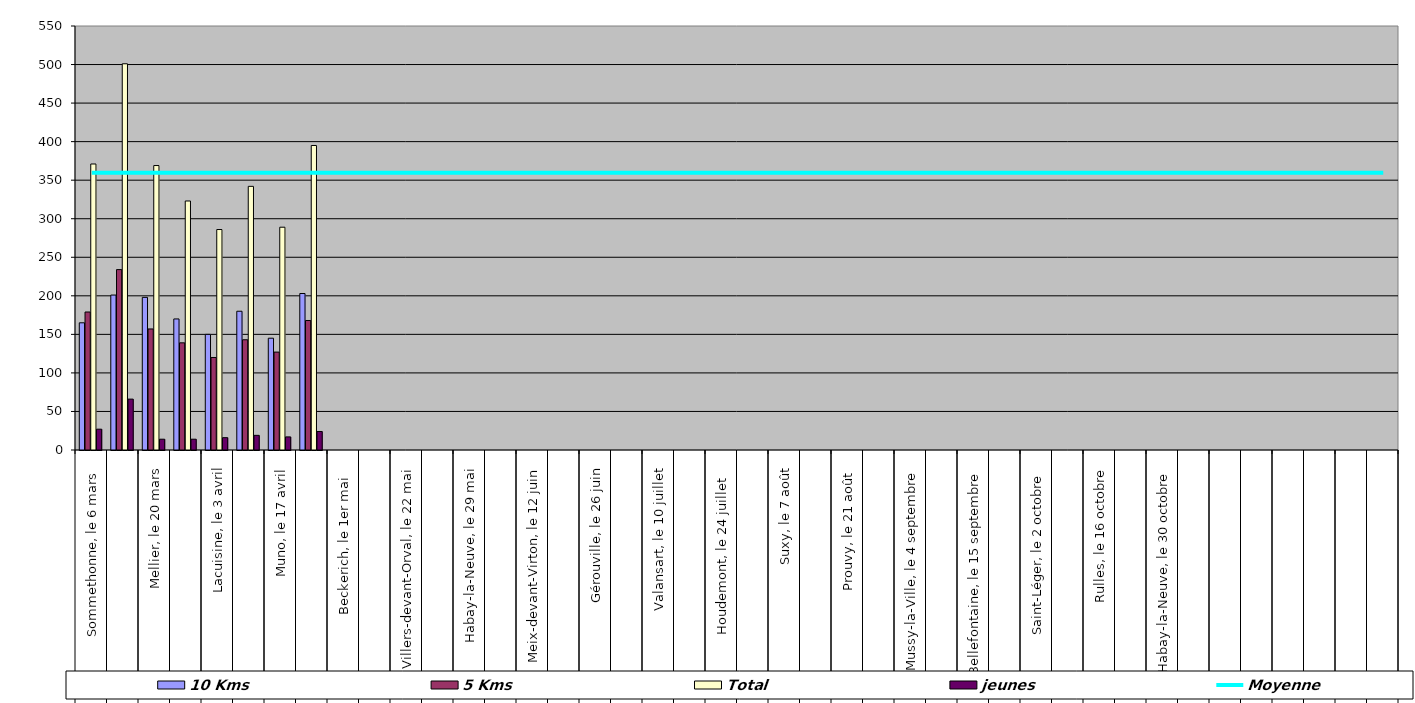
| Category | 10 Kms | 5 Kms | Total | jeunes |
|---|---|---|---|---|
| 0 | 165 | 179 | 371 | 27 |
| 1 | 201 | 234 | 501 | 66 |
| 2 | 198 | 157 | 369 | 14 |
| 3 | 170 | 139 | 323 | 14 |
| 4 | 150 | 120 | 286 | 16 |
| 5 | 180 | 143 | 342 | 19 |
| 6 | 145 | 127 | 289 | 17 |
| 7 | 203 | 168 | 395 | 24 |
| 8 | 0 | 0 | 0 | 0 |
| 9 | 0 | 0 | 0 | 0 |
| 10 | 0 | 0 | 0 | 0 |
| 11 | 0 | 0 | 0 | 0 |
| 12 | 0 | 0 | 0 | 0 |
| 13 | 0 | 0 | 0 | 0 |
| 14 | 0 | 0 | 0 | 0 |
| 15 | 0 | 0 | 0 | 0 |
| 16 | 0 | 0 | 0 | 0 |
| 17 | 0 | 0 | 0 | 0 |
| 18 | 0 | 0 | 0 | 0 |
| 19 | 0 | 0 | 0 | 0 |
| 20 | 0 | 0 | 0 | 0 |
| 21 | 0 | 0 | 0 | 0 |
| 22 | 0 | 0 | 0 | 0 |
| 23 | 0 | 0 | 0 | 0 |
| 24 | 0 | 0 | 0 | 0 |
| 25 | 0 | 0 | 0 | 0 |
| 26 | 0 | 0 | 0 | 0 |
| 27 | 0 | 0 | 0 | 0 |
| 28 | 0 | 0 | 0 | 0 |
| 29 | 0 | 0 | 0 | 0 |
| 30 | 0 | 0 | 0 | 0 |
| 31 | 0 | 0 | 0 | 0 |
| 32 | 0 | 0 | 0 | 0 |
| 33 | 0 | 0 | 0 | 0 |
| 34 | 0 | 0 | 0 | 0 |
| 35 | 0 | 0 | 0 | 0 |
| 36 | 0 | 0 | 0 | 0 |
| 37 | 0 | 0 | 0 | 0 |
| 38 | 0 | 0 | 0 | 0 |
| 39 | 0 | 0 | 0 | 0 |
| 40 | 0 | 0 | 0 | 0 |
| 41 | 0 | 0 | 0 | 0 |